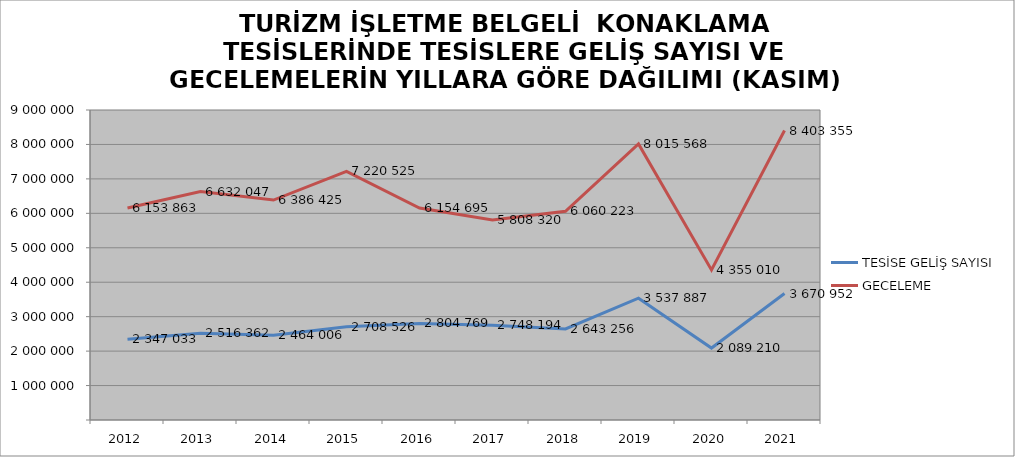
| Category | TESİSE GELİŞ SAYISI | GECELEME |
|---|---|---|
| 2012 | 2347033 | 6153863 |
| 2013 | 2516362 | 6632047 |
| 2014 | 2464006 | 6386425 |
| 2015 | 2708526 | 7220525 |
| 2016 | 2804769 | 6154695 |
| 2017 | 2748194 | 5808320 |
| 2018 | 2643256 | 6060223 |
| 2019 | 3537887 | 8015568 |
| 2020 | 2089210 | 4355010 |
| 2021 | 3670952 | 8403355 |